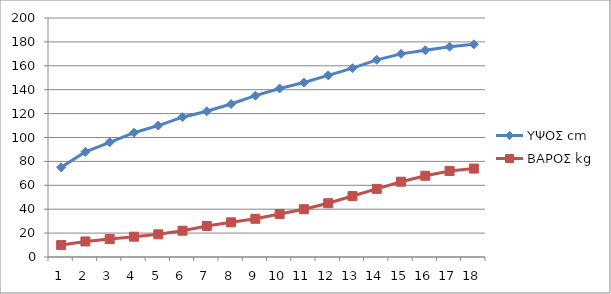
| Category | ΥΨΟΣ cm | ΒΑΡΟΣ kg |
|---|---|---|
| 0 | 75 | 10 |
| 1 | 88 | 13 |
| 2 | 96 | 15 |
| 3 | 104 | 17 |
| 4 | 110 | 19 |
| 5 | 117 | 22 |
| 6 | 122 | 26 |
| 7 | 128 | 29 |
| 8 | 135 | 32 |
| 9 | 141 | 36 |
| 10 | 146 | 40 |
| 11 | 152 | 45 |
| 12 | 158 | 51 |
| 13 | 165 | 57 |
| 14 | 170 | 63 |
| 15 | 173 | 68 |
| 16 | 176 | 72 |
| 17 | 178 | 74 |